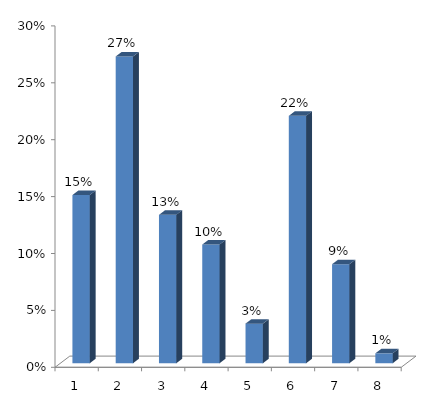
| Category | Series 0 |
|---|---|
| 0 | 0.148 |
| 1 | 0.27 |
| 2 | 0.13 |
| 3 | 0.104 |
| 4 | 0.035 |
| 5 | 0.217 |
| 6 | 0.087 |
| 7 | 0.009 |